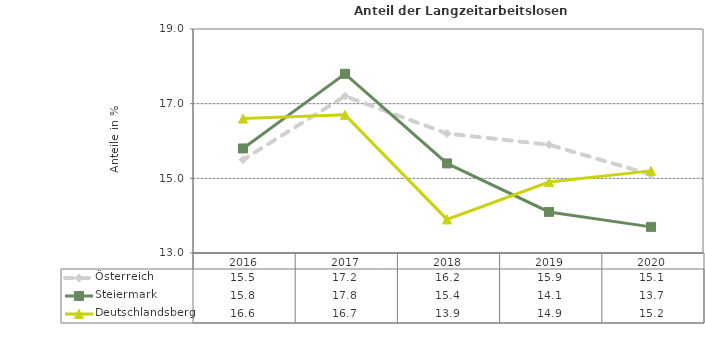
| Category | Österreich | Steiermark | Deutschlandsberg |
|---|---|---|---|
| 2020.0 | 15.1 | 13.7 | 15.2 |
| 2019.0 | 15.9 | 14.1 | 14.9 |
| 2018.0 | 16.2 | 15.4 | 13.9 |
| 2017.0 | 17.2 | 17.8 | 16.7 |
| 2016.0 | 15.5 | 15.8 | 16.6 |